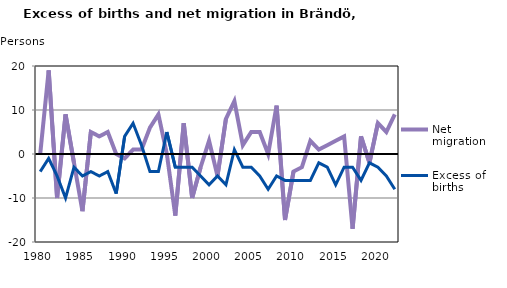
| Category | Net migration | Excess of births |
|---|---|---|
| 1980.0 | 0 | -4 |
| 1981.0 | 19 | -1 |
| 1982.0 | -10 | -5 |
| 1983.0 | 9 | -10 |
| 1984.0 | -2 | -3 |
| 1985.0 | -13 | -5 |
| 1986.0 | 5 | -4 |
| 1987.0 | 4 | -5 |
| 1988.0 | 5 | -4 |
| 1989.0 | 0 | -9 |
| 1990.0 | -1 | 4 |
| 1991.0 | 1 | 7 |
| 1992.0 | 1 | 2 |
| 1993.0 | 6 | -4 |
| 1994.0 | 9 | -4 |
| 1995.0 | 0 | 5 |
| 1996.0 | -14 | -3 |
| 1997.0 | 7 | -3 |
| 1998.0 | -10 | -3 |
| 1999.0 | -3 | -5 |
| 2000.0 | 3 | -7 |
| 2001.0 | -5 | -5 |
| 2002.0 | 8 | -7 |
| 2003.0 | 12 | 1 |
| 2004.0 | 2 | -3 |
| 2005.0 | 5 | -3 |
| 2006.0 | 5 | -5 |
| 2007.0 | 0 | -8 |
| 2008.0 | 11 | -5 |
| 2009.0 | -15 | -6 |
| 2010.0 | -4 | -6 |
| 2011.0 | -3 | -6 |
| 2012.0 | 3 | -6 |
| 2013.0 | 1 | -2 |
| 2014.0 | 2 | -3 |
| 2015.0 | 3 | -7 |
| 2016.0 | 4 | -3 |
| 2017.0 | -17 | -3 |
| 2018.0 | 4 | -6 |
| 2019.0 | -2 | -2 |
| 2020.0 | 7 | -3 |
| 2021.0 | 5 | -5 |
| 2022.0 | 9 | -8 |